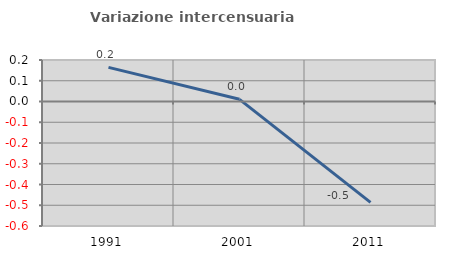
| Category | Variazione intercensuaria annua |
|---|---|
| 1991.0 | 0.165 |
| 2001.0 | 0.011 |
| 2011.0 | -0.486 |